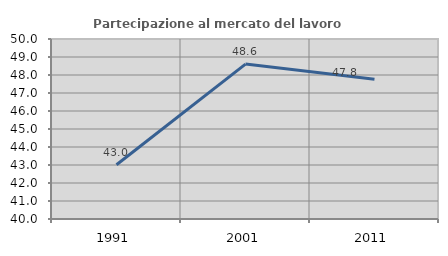
| Category | Partecipazione al mercato del lavoro  femminile |
|---|---|
| 1991.0 | 43.011 |
| 2001.0 | 48.606 |
| 2011.0 | 47.761 |